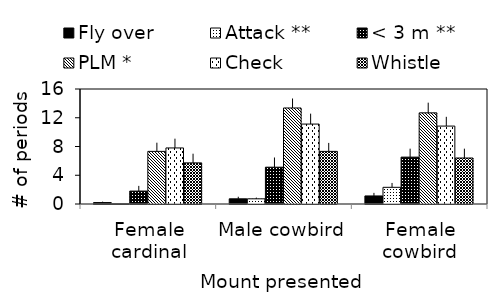
| Category | Fly over | Attack ** | < 3 m ** | PLM * | Check | Whistle |
|---|---|---|---|---|---|---|
| Female cardinal | 0.2 | 0.04 | 1.8 | 7.32 | 7.8 | 5.72 |
| Male cowbird | 0.72 | 0.72 | 5.12 | 13.36 | 11.12 | 7.32 |
| Female cowbird | 1.12 | 2.32 | 6.52 | 12.68 | 10.84 | 6.4 |